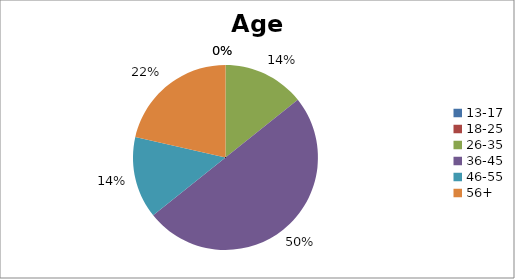
| Category | Age Group |
|---|---|
| 13-17 | 0 |
| 18-25 | 0 |
| 26-35 | 2 |
| 36-45 | 7 |
| 46-55 | 2 |
| 56+ | 3 |